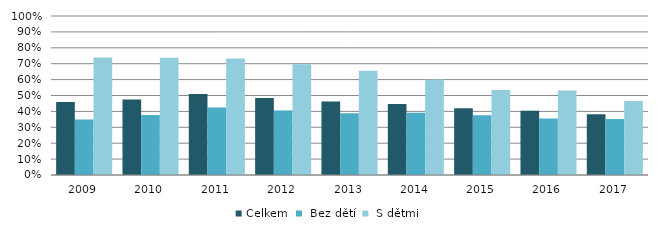
| Category | Celkem |  Bez dětí |  S dětmi |
|---|---|---|---|
| 2009.0 | 0.459 | 0.349 | 0.74 |
| 2010.0 | 0.474 | 0.378 | 0.737 |
| 2011.0 | 0.509 | 0.424 | 0.733 |
| 2012.0 | 0.485 | 0.406 | 0.697 |
| 2013.0 | 0.463 | 0.388 | 0.655 |
| 2014.0 | 0.447 | 0.391 | 0.601 |
| 2015.0 | 0.419 | 0.375 | 0.534 |
| 2016.0 | 0.404 | 0.356 | 0.532 |
| 2017.0 | 0.382 | 0.352 | 0.466 |